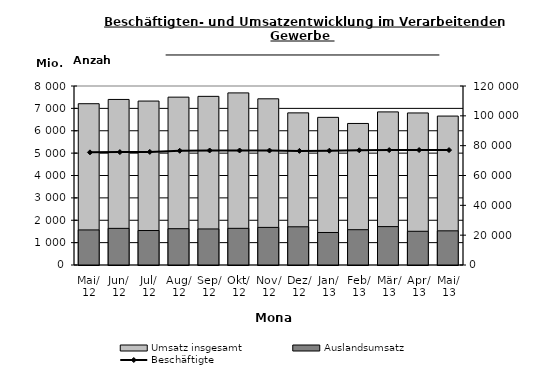
| Category | Umsatz insgesamt | Auslandsumsatz |
|---|---|---|
| 2012-05-01 | 7208.203 | 1567.272 |
| 2012-06-01 | 7399.131 | 1636.887 |
| 2012-07-01 | 7327.339 | 1540.606 |
| 2012-08-01 | 7501.535 | 1622.307 |
| 2012-09-01 | 7537.073 | 1611.325 |
| 2012-10-01 | 7691.386 | 1638.671 |
| 2012-11-01 | 7427.668 | 1680.559 |
| 2012-12-01 | 6799.178 | 1707.786 |
| 2013-01-01 | 6598.983 | 1453.122 |
| 2013-02-01 | 6326.057 | 1578.148 |
| 2013-03-01 | 6842.406 | 1716.184 |
| 2013-04-01 | 6794.91 | 1506.622 |
| 2013-05-01 | 6656.393 | 1527.199 |